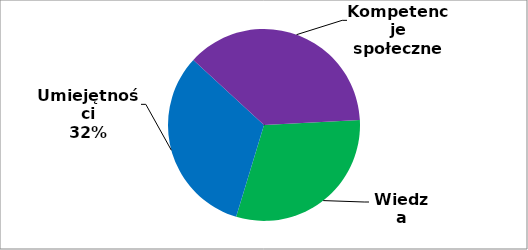
| Category | Series 0 |
|---|---|
| 0 | 112 |
| 1 | 118 |
| 2 | 137 |